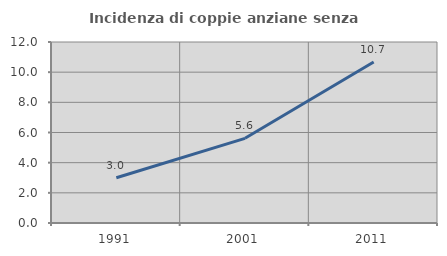
| Category | Incidenza di coppie anziane senza figli  |
|---|---|
| 1991.0 | 3.001 |
| 2001.0 | 5.613 |
| 2011.0 | 10.675 |